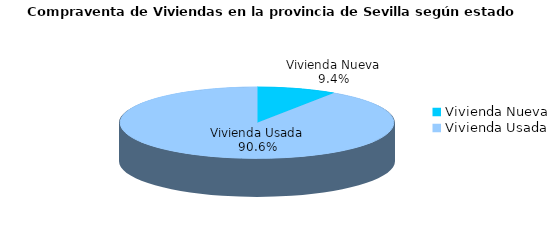
| Category | Series 0 | Series 1 |
|---|---|---|
| Vivienda Nueva | 87 | 0.094 |
| Vivienda Usada | 840 | 0.906 |